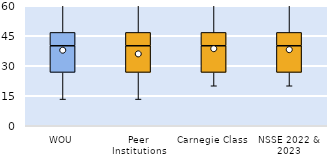
| Category | 25th | 50th | 75th |
|---|---|---|---|
| WOU | 26.667 | 13.333 | 6.667 |
| Peer Institutions | 26.667 | 13.333 | 6.667 |
| Carnegie Class | 26.667 | 13.333 | 6.667 |
| NSSE 2022 & 2023 | 26.667 | 13.333 | 6.667 |